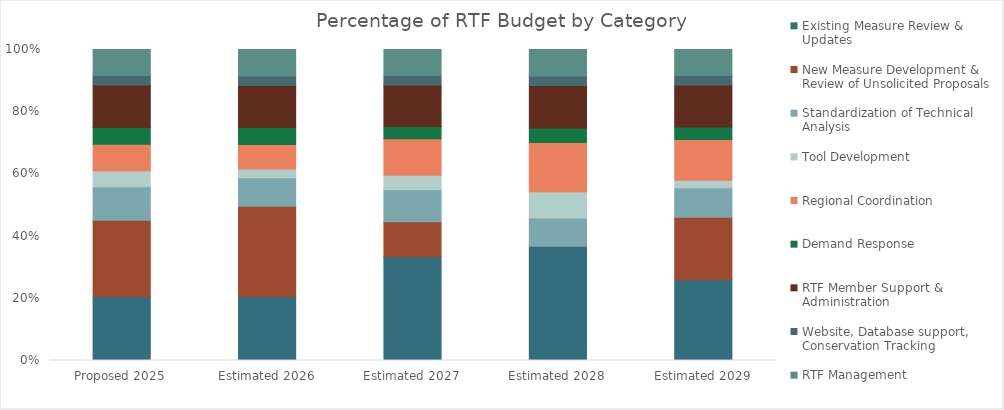
| Category | Existing Measure Review & Updates | New Measure Development & Review of Unsolicited Proposals | Standardization of Technical Analysis | Tool Development | Regional Coordination | Demand Response | RTF Member Support & Administration | Website, Database support, Conservation Tracking  | RTF Management |
|---|---|---|---|---|---|---|---|---|---|
| Proposed 2025 | 0.205 | 0.246 | 0.108 | 0.052 | 0.085 | 0.054 | 0.137 | 0.03 | 0.084 |
| Estimated 2026 | 0.205 | 0.291 | 0.092 | 0.029 | 0.078 | 0.055 | 0.135 | 0.03 | 0.085 |
| Estimated 2027 | 0.335 | 0.112 | 0.102 | 0.047 | 0.118 | 0.039 | 0.134 | 0.03 | 0.084 |
| Estimated 2028 | 0.367 | 0 | 0.091 | 0.084 | 0.158 | 0.047 | 0.137 | 0.03 | 0.085 |
| Estimated 2029 | 0.259 | 0.201 | 0.094 | 0.024 | 0.131 | 0.04 | 0.135 | 0.03 | 0.084 |